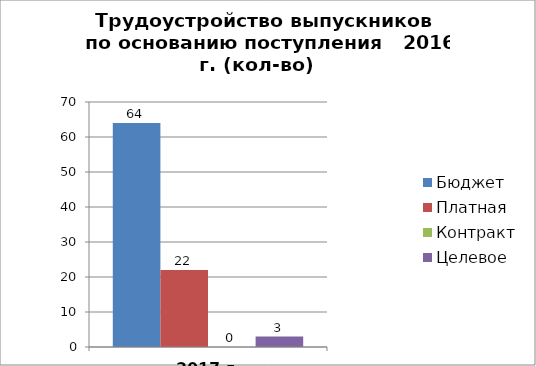
| Category | Бюджет | Платная | Контракт | Целевое |
|---|---|---|---|---|
| 2017 г. | 64 | 22 | 0 | 3 |